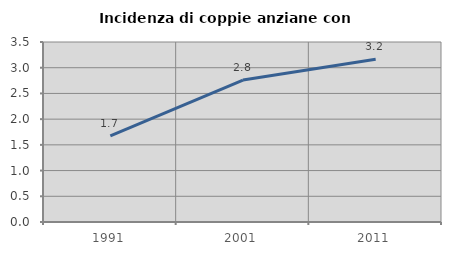
| Category | Incidenza di coppie anziane con figli |
|---|---|
| 1991.0 | 1.676 |
| 2001.0 | 2.76 |
| 2011.0 | 3.164 |